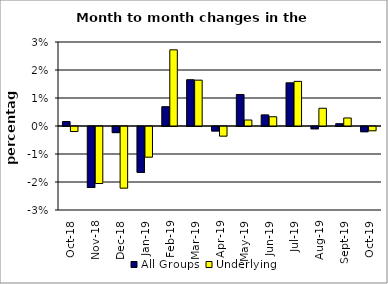
| Category | All Groups | Underlying |
|---|---|---|
| 2018-10-01 | 0.002 | -0.002 |
| 2018-11-01 | -0.022 | -0.02 |
| 2018-12-01 | -0.002 | -0.022 |
| 2019-01-01 | -0.016 | -0.011 |
| 2019-02-01 | 0.007 | 0.027 |
| 2019-03-01 | 0.017 | 0.016 |
| 2019-04-01 | -0.002 | -0.003 |
| 2019-05-01 | 0.011 | 0.002 |
| 2019-06-01 | 0.004 | 0.003 |
| 2019-07-01 | 0.015 | 0.016 |
| 2019-08-01 | -0.001 | 0.006 |
| 2019-09-01 | 0.001 | 0.003 |
| 2019-10-01 | -0.002 | -0.002 |